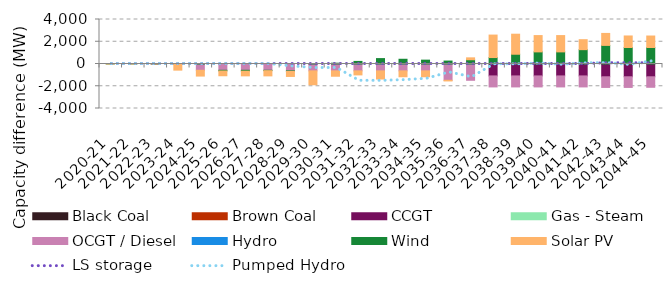
| Category | Black Coal | Brown Coal | CCGT | Gas - Steam | OCGT / Diesel | Hydro | Wind | Solar PV |
|---|---|---|---|---|---|---|---|---|
| 2020-21 | 0 | 0 | 0 | 0 | 0 | 0 | 0.009 | 0.003 |
| 2021-22 | 0 | 0 | 0 | 0 | 0 | 0 | 0.01 | 0.004 |
| 2022-23 | 0 | 0 | 0.001 | 0 | 0.002 | 0 | 0.01 | 0.004 |
| 2023-24 | 0 | 0 | 0.001 | 0 | -30.514 | 0 | 0.012 | -520.356 |
| 2024-25 | 0 | 0 | 0.001 | 0 | -565.022 | 0 | 0.014 | -520.36 |
| 2025-26 | 0 | 0 | 0.001 | 0 | -565.022 | 0 | -59.483 | -431.865 |
| 2026-27 | 0 | 0 | 0.001 | 0 | -565.022 | 0 | -76.791 | -423.764 |
| 2027-28 | 0 | 0 | 0.001 | 0 | -565.022 | 0 | -33.268 | -469.272 |
| 2028-29 | 0 | 0 | 0.001 | 0 | -616.188 | 0 | -47.037 | -454.752 |
| 2029-30 | 0 | 0 | 0.001 | 0 | -616.188 | 0 | 42.67 | -1248.08 |
| 2030-31 | 0 | 0 | 0.001 | 0 | -616.188 | 0 | 72.899 | -484.492 |
| 2031-32 | 0 | 0 | 0.001 | 0 | -616.188 | 0 | 232.475 | -363.065 |
| 2032-33 | 0 | 0 | 0.001 | 0 | -616.188 | 0 | 485.723 | -735.32 |
| 2033-34 | 0 | 0 | 0.001 | 0 | -616.187 | 0 | 425.626 | -530.361 |
| 2034-35 | 0 | 0 | 0.001 | 0 | -616.187 | 0 | 346.676 | -530.361 |
| 2035-36 | 0 | 0 | 0 | 0 | -1463.782 | 0 | 264.894 | -59.584 |
| 2036-37 | 0 | 0 | 0 | 0 | -1463.782 | 0 | 382.464 | 170.873 |
| 2037-38 | 0 | 0 | -1071.405 | 0 | -988.488 | 0 | 580.004 | 2019.952 |
| 2038-39 | 0 | 0 | -1071.405 | 0 | -988.488 | 0 | 877.351 | 1800.72 |
| 2039-40 | 0 | 0 | -1071.405 | 0 | -988.488 | 0 | 1089.216 | 1465.55 |
| 2040-41 | 0 | 0 | -1071.405 | 0 | -988.487 | 0 | 1089.216 | 1465.55 |
| 2041-42 | 0 | 0 | -1071.405 | 0 | -988.486 | 0 | 1289.584 | 895.933 |
| 2042-43 | 0 | 0 | -1148.274 | 0 | -957.791 | 0 | 1671.925 | 1076.634 |
| 2043-44 | 0 | 0 | -1148.274 | 0 | -957.791 | 0 | 1485.204 | 1034.386 |
| 2044-45 | 0 | 0 | -1148.274 | 0 | -945.726 | 0 | 1480.725 | 1034.386 |